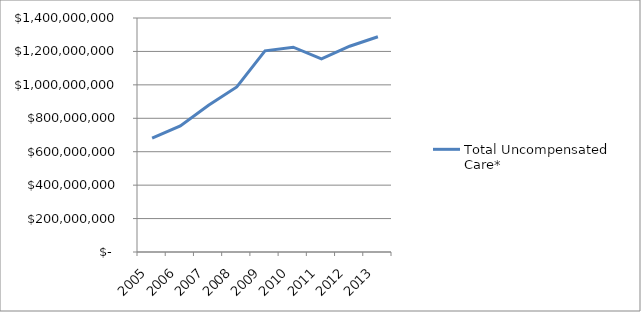
| Category | Total Uncompensated Care* |
|---|---|
| 2005.0 | 681598211 |
| 2006.0 | 754448980 |
| 2007.0 | 877481965 |
| 2008.0 | 987731808 |
| 2009.0 | 1203336676 |
| 2010.0 | 1225124698 |
| 2011.0 | 1155664735 |
| 2012.0 | 1231237200 |
| 2013.0 | 1287828698 |